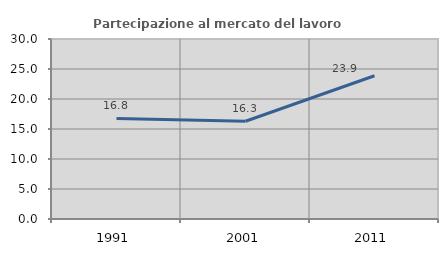
| Category | Partecipazione al mercato del lavoro  femminile |
|---|---|
| 1991.0 | 16.763 |
| 2001.0 | 16.292 |
| 2011.0 | 23.873 |